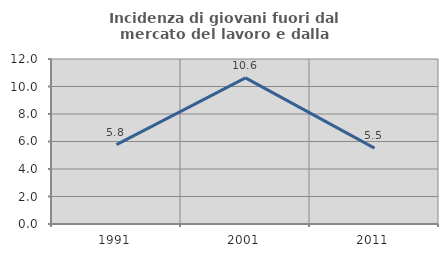
| Category | Incidenza di giovani fuori dal mercato del lavoro e dalla formazione  |
|---|---|
| 1991.0 | 5.769 |
| 2001.0 | 10.623 |
| 2011.0 | 5.519 |